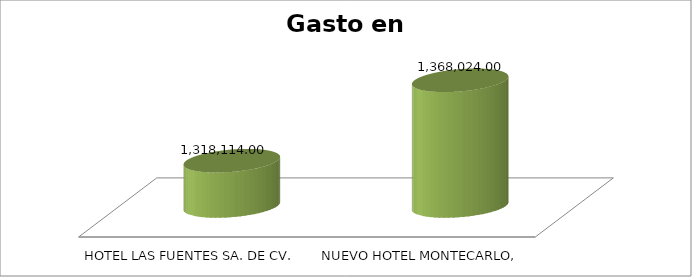
| Category | SUMA |
|---|---|
| HOTEL LAS FUENTES SA. DE CV. | 1318114 |
| NUEVO HOTEL MONTECARLO, S.A. DE C.V. | 1368024 |